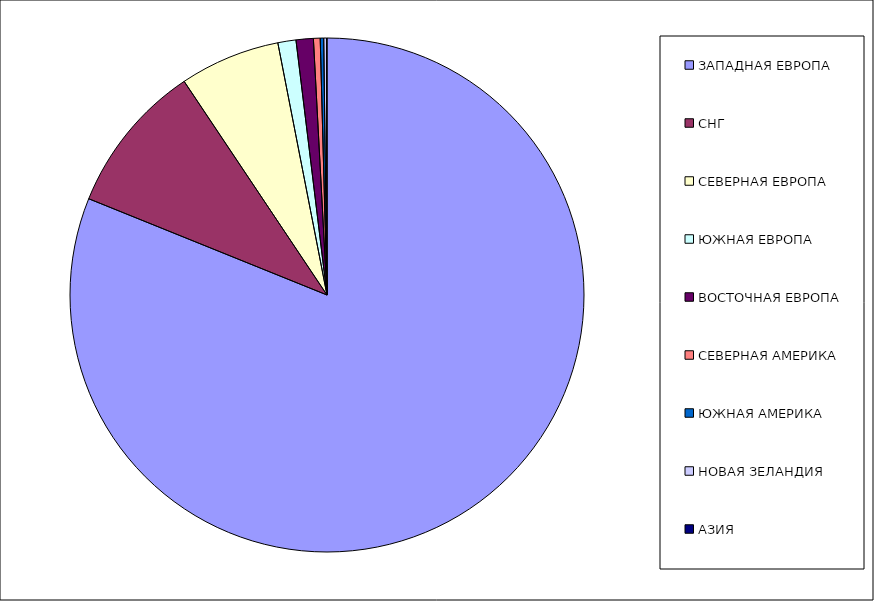
| Category | Оборот |
|---|---|
| ЗАПАДНАЯ ЕВРОПА | 0.811 |
| СНГ | 0.095 |
| СЕВЕРНАЯ ЕВРОПА | 0.063 |
| ЮЖНАЯ ЕВРОПА | 0.011 |
| ВОСТОЧНАЯ ЕВРОПА | 0.011 |
| СЕВЕРНАЯ АМЕРИКА | 0.004 |
| ЮЖНАЯ АМЕРИКА | 0.002 |
| НОВАЯ ЗЕЛАНДИЯ | 0.002 |
| АЗИЯ | 0 |